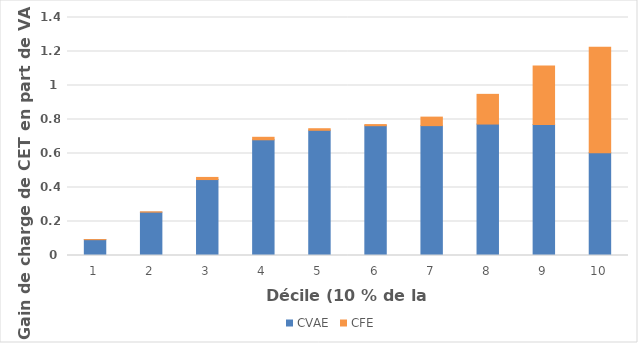
| Category | CVAE | CFE |
|---|---|---|
| 1.0 | 0.093 | 0 |
| 2.0 | 0.255 | 0.002 |
| 3.0 | 0.447 | 0.013 |
| 4.0 | 0.681 | 0.015 |
| 5.0 | 0.736 | 0.009 |
| 6.0 | 0.763 | 0.007 |
| 7.0 | 0.764 | 0.05 |
| 8.0 | 0.773 | 0.175 |
| 9.0 | 0.77 | 0.345 |
| 10.0 | 0.604 | 0.621 |